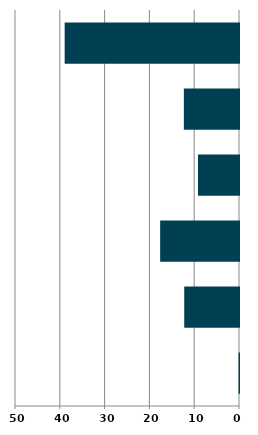
| Category | Series 0 |
|---|---|
| 0 | 0.097 |
| 1 | 12.225 |
| 2 | 17.6 |
| 3 | 9.152 |
| 4 | 12.312 |
| 5 | 38.914 |